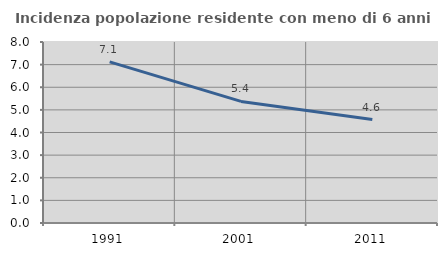
| Category | Incidenza popolazione residente con meno di 6 anni |
|---|---|
| 1991.0 | 7.123 |
| 2001.0 | 5.374 |
| 2011.0 | 4.57 |